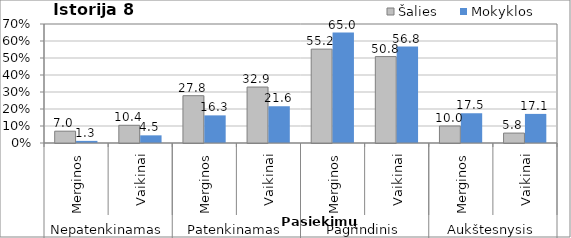
| Category | Šalies | Mokyklos |
|---|---|---|
| 0 | 6.957 | 1.25 |
| 1 | 10.417 | 4.505 |
| 2 | 27.826 | 16.25 |
| 3 | 32.917 | 21.622 |
| 4 | 55.217 | 65 |
| 5 | 50.833 | 56.757 |
| 6 | 10 | 17.5 |
| 7 | 5.833 | 17.117 |